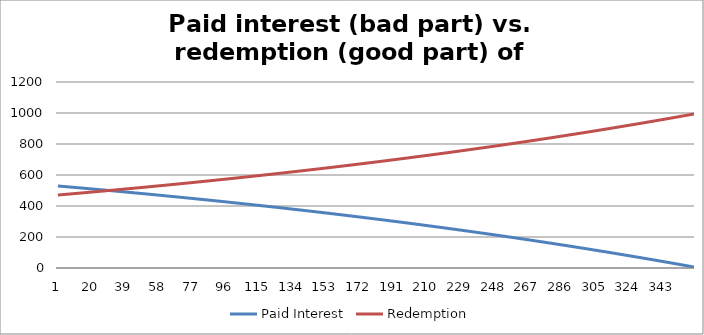
| Category | Paid Interest | Redemption |
|---|---|---|
| 0 | 529.167 | 470.833 |
| 1 | 528.186 | 471.814 |
| 2 | 527.203 | 472.797 |
| 3 | 526.218 | 473.782 |
| 4 | 525.231 | 474.769 |
| 5 | 524.242 | 475.758 |
| 6 | 523.251 | 476.749 |
| 7 | 522.257 | 477.743 |
| 8 | 521.262 | 478.738 |
| 9 | 520.265 | 479.735 |
| 10 | 519.265 | 480.735 |
| 11 | 518.264 | 481.736 |
| 12 | 517.26 | 482.74 |
| 13 | 516.254 | 483.746 |
| 14 | 515.247 | 484.753 |
| 15 | 514.237 | 485.763 |
| 16 | 513.225 | 486.775 |
| 17 | 512.21 | 487.79 |
| 18 | 511.194 | 488.806 |
| 19 | 510.176 | 489.824 |
| 20 | 509.155 | 490.845 |
| 21 | 508.133 | 491.867 |
| 22 | 507.108 | 492.892 |
| 23 | 506.081 | 493.919 |
| 24 | 505.052 | 494.948 |
| 25 | 504.021 | 495.979 |
| 26 | 502.988 | 497.012 |
| 27 | 501.952 | 498.048 |
| 28 | 500.915 | 499.085 |
| 29 | 499.875 | 500.125 |
| 30 | 498.833 | 501.167 |
| 31 | 497.789 | 502.211 |
| 32 | 496.743 | 503.257 |
| 33 | 495.694 | 504.306 |
| 34 | 494.644 | 505.356 |
| 35 | 493.591 | 506.409 |
| 36 | 492.536 | 507.464 |
| 37 | 491.479 | 508.521 |
| 38 | 490.419 | 509.581 |
| 39 | 489.358 | 510.642 |
| 40 | 488.294 | 511.706 |
| 41 | 487.228 | 512.772 |
| 42 | 486.159 | 513.841 |
| 43 | 485.089 | 514.911 |
| 44 | 484.016 | 515.984 |
| 45 | 482.941 | 517.059 |
| 46 | 481.864 | 518.136 |
| 47 | 480.785 | 519.215 |
| 48 | 479.703 | 520.297 |
| 49 | 478.619 | 521.381 |
| 50 | 477.533 | 522.467 |
| 51 | 476.444 | 523.556 |
| 52 | 475.353 | 524.647 |
| 53 | 474.26 | 525.74 |
| 54 | 473.165 | 526.835 |
| 55 | 472.068 | 527.932 |
| 56 | 470.968 | 529.032 |
| 57 | 469.866 | 530.134 |
| 58 | 468.761 | 531.239 |
| 59 | 467.654 | 532.346 |
| 60 | 466.545 | 533.455 |
| 61 | 465.434 | 534.566 |
| 62 | 464.32 | 535.68 |
| 63 | 463.204 | 536.796 |
| 64 | 462.086 | 537.914 |
| 65 | 460.965 | 539.035 |
| 66 | 459.842 | 540.158 |
| 67 | 458.717 | 541.283 |
| 68 | 457.589 | 542.411 |
| 69 | 456.459 | 543.541 |
| 70 | 455.327 | 544.673 |
| 71 | 454.192 | 545.808 |
| 72 | 453.055 | 546.945 |
| 73 | 451.916 | 548.084 |
| 74 | 450.774 | 549.226 |
| 75 | 449.63 | 550.37 |
| 76 | 448.483 | 551.517 |
| 77 | 447.334 | 552.666 |
| 78 | 446.183 | 553.817 |
| 79 | 445.029 | 554.971 |
| 80 | 443.873 | 556.127 |
| 81 | 442.714 | 557.286 |
| 82 | 441.553 | 558.447 |
| 83 | 440.39 | 559.61 |
| 84 | 439.224 | 560.776 |
| 85 | 438.055 | 561.945 |
| 86 | 436.885 | 563.115 |
| 87 | 435.712 | 564.288 |
| 88 | 434.536 | 565.464 |
| 89 | 433.358 | 566.642 |
| 90 | 432.177 | 567.823 |
| 91 | 430.994 | 569.006 |
| 92 | 429.809 | 570.191 |
| 93 | 428.621 | 571.379 |
| 94 | 427.431 | 572.569 |
| 95 | 426.238 | 573.762 |
| 96 | 425.042 | 574.958 |
| 97 | 423.845 | 576.155 |
| 98 | 422.644 | 577.356 |
| 99 | 421.442 | 578.558 |
| 100 | 420.236 | 579.764 |
| 101 | 419.028 | 580.972 |
| 102 | 417.818 | 582.182 |
| 103 | 416.605 | 583.395 |
| 104 | 415.39 | 584.61 |
| 105 | 414.172 | 585.828 |
| 106 | 412.951 | 587.049 |
| 107 | 411.728 | 588.272 |
| 108 | 410.503 | 589.497 |
| 109 | 409.275 | 590.725 |
| 110 | 408.044 | 591.956 |
| 111 | 406.811 | 593.189 |
| 112 | 405.575 | 594.425 |
| 113 | 404.336 | 595.664 |
| 114 | 403.096 | 596.904 |
| 115 | 401.852 | 598.148 |
| 116 | 400.606 | 599.394 |
| 117 | 399.357 | 600.643 |
| 118 | 398.106 | 601.894 |
| 119 | 396.852 | 603.148 |
| 120 | 395.595 | 604.405 |
| 121 | 394.336 | 605.664 |
| 122 | 393.074 | 606.926 |
| 123 | 391.81 | 608.19 |
| 124 | 390.543 | 609.457 |
| 125 | 389.273 | 610.727 |
| 126 | 388.001 | 611.999 |
| 127 | 386.726 | 613.274 |
| 128 | 385.448 | 614.552 |
| 129 | 384.168 | 615.832 |
| 130 | 382.885 | 617.115 |
| 131 | 381.599 | 618.401 |
| 132 | 380.311 | 619.689 |
| 133 | 379.02 | 620.98 |
| 134 | 377.726 | 622.274 |
| 135 | 376.43 | 623.57 |
| 136 | 375.131 | 624.869 |
| 137 | 373.829 | 626.171 |
| 138 | 372.524 | 627.476 |
| 139 | 371.217 | 628.783 |
| 140 | 369.907 | 630.093 |
| 141 | 368.594 | 631.406 |
| 142 | 367.279 | 632.721 |
| 143 | 365.961 | 634.039 |
| 144 | 364.64 | 635.36 |
| 145 | 363.316 | 636.684 |
| 146 | 361.99 | 638.01 |
| 147 | 360.661 | 639.339 |
| 148 | 359.329 | 640.671 |
| 149 | 357.994 | 642.006 |
| 150 | 356.656 | 643.344 |
| 151 | 355.316 | 644.684 |
| 152 | 353.973 | 646.027 |
| 153 | 352.627 | 647.373 |
| 154 | 351.278 | 648.722 |
| 155 | 349.927 | 650.073 |
| 156 | 348.573 | 651.427 |
| 157 | 347.215 | 652.785 |
| 158 | 345.855 | 654.145 |
| 159 | 344.493 | 655.507 |
| 160 | 343.127 | 656.873 |
| 161 | 341.758 | 658.242 |
| 162 | 340.387 | 659.613 |
| 163 | 339.013 | 660.987 |
| 164 | 337.636 | 662.364 |
| 165 | 336.256 | 663.744 |
| 166 | 334.873 | 665.127 |
| 167 | 333.487 | 666.513 |
| 168 | 332.099 | 667.901 |
| 169 | 330.707 | 669.293 |
| 170 | 329.313 | 670.687 |
| 171 | 327.916 | 672.084 |
| 172 | 326.516 | 673.484 |
| 173 | 325.113 | 674.887 |
| 174 | 323.707 | 676.293 |
| 175 | 322.298 | 677.702 |
| 176 | 320.886 | 679.114 |
| 177 | 319.471 | 680.529 |
| 178 | 318.053 | 681.947 |
| 179 | 316.632 | 683.368 |
| 180 | 315.209 | 684.791 |
| 181 | 313.782 | 686.218 |
| 182 | 312.352 | 687.648 |
| 183 | 310.92 | 689.08 |
| 184 | 309.484 | 690.516 |
| 185 | 308.046 | 691.954 |
| 186 | 306.604 | 693.396 |
| 187 | 305.16 | 694.84 |
| 188 | 303.712 | 696.288 |
| 189 | 302.261 | 697.739 |
| 190 | 300.808 | 699.192 |
| 191 | 299.351 | 700.649 |
| 192 | 297.891 | 702.109 |
| 193 | 296.429 | 703.571 |
| 194 | 294.963 | 705.037 |
| 195 | 293.494 | 706.506 |
| 196 | 292.022 | 707.978 |
| 197 | 290.547 | 709.453 |
| 198 | 289.069 | 710.931 |
| 199 | 287.588 | 712.412 |
| 200 | 286.104 | 713.896 |
| 201 | 284.617 | 715.383 |
| 202 | 283.126 | 716.874 |
| 203 | 281.633 | 718.367 |
| 204 | 280.136 | 719.864 |
| 205 | 278.636 | 721.364 |
| 206 | 277.134 | 722.866 |
| 207 | 275.628 | 724.372 |
| 208 | 274.119 | 725.881 |
| 209 | 272.606 | 727.394 |
| 210 | 271.091 | 728.909 |
| 211 | 269.572 | 730.428 |
| 212 | 268.051 | 731.949 |
| 213 | 266.526 | 733.474 |
| 214 | 264.998 | 735.002 |
| 215 | 263.466 | 736.534 |
| 216 | 261.932 | 738.068 |
| 217 | 260.394 | 739.606 |
| 218 | 258.853 | 741.147 |
| 219 | 257.309 | 742.691 |
| 220 | 255.762 | 744.238 |
| 221 | 254.212 | 745.788 |
| 222 | 252.658 | 747.342 |
| 223 | 251.101 | 748.899 |
| 224 | 249.541 | 750.459 |
| 225 | 247.977 | 752.023 |
| 226 | 246.411 | 753.589 |
| 227 | 244.841 | 755.159 |
| 228 | 243.267 | 756.733 |
| 229 | 241.691 | 758.309 |
| 230 | 240.111 | 759.889 |
| 231 | 238.528 | 761.472 |
| 232 | 236.941 | 763.059 |
| 233 | 235.352 | 764.648 |
| 234 | 233.759 | 766.241 |
| 235 | 232.162 | 767.838 |
| 236 | 230.563 | 769.437 |
| 237 | 228.96 | 771.04 |
| 238 | 227.353 | 772.647 |
| 239 | 225.744 | 774.256 |
| 240 | 224.131 | 775.869 |
| 241 | 222.514 | 777.486 |
| 242 | 220.895 | 779.105 |
| 243 | 219.271 | 780.729 |
| 244 | 217.645 | 782.355 |
| 245 | 216.015 | 783.985 |
| 246 | 214.382 | 785.618 |
| 247 | 212.745 | 787.255 |
| 248 | 211.105 | 788.895 |
| 249 | 209.461 | 790.539 |
| 250 | 207.814 | 792.186 |
| 251 | 206.164 | 793.836 |
| 252 | 204.51 | 795.49 |
| 253 | 202.853 | 797.147 |
| 254 | 201.192 | 798.808 |
| 255 | 199.528 | 800.472 |
| 256 | 197.86 | 802.14 |
| 257 | 196.189 | 803.811 |
| 258 | 194.515 | 805.485 |
| 259 | 192.837 | 807.163 |
| 260 | 191.155 | 808.845 |
| 261 | 189.47 | 810.53 |
| 262 | 187.781 | 812.219 |
| 263 | 186.089 | 813.911 |
| 264 | 184.393 | 815.607 |
| 265 | 182.694 | 817.306 |
| 266 | 180.992 | 819.008 |
| 267 | 179.285 | 820.715 |
| 268 | 177.575 | 822.425 |
| 269 | 175.862 | 824.138 |
| 270 | 174.145 | 825.855 |
| 271 | 172.425 | 827.575 |
| 272 | 170.7 | 829.3 |
| 273 | 168.973 | 831.027 |
| 274 | 167.241 | 832.759 |
| 275 | 165.507 | 834.493 |
| 276 | 163.768 | 836.232 |
| 277 | 162.026 | 837.974 |
| 278 | 160.28 | 839.72 |
| 279 | 158.531 | 841.469 |
| 280 | 156.778 | 843.222 |
| 281 | 155.021 | 844.979 |
| 282 | 153.261 | 846.739 |
| 283 | 151.496 | 848.504 |
| 284 | 149.729 | 850.271 |
| 285 | 147.957 | 852.043 |
| 286 | 146.182 | 853.818 |
| 287 | 144.404 | 855.596 |
| 288 | 142.621 | 857.379 |
| 289 | 140.835 | 859.165 |
| 290 | 139.045 | 860.955 |
| 291 | 137.251 | 862.749 |
| 292 | 135.454 | 864.546 |
| 293 | 133.653 | 866.347 |
| 294 | 131.848 | 868.152 |
| 295 | 130.039 | 869.961 |
| 296 | 128.227 | 871.773 |
| 297 | 126.411 | 873.589 |
| 298 | 124.591 | 875.409 |
| 299 | 122.767 | 877.233 |
| 300 | 120.939 | 879.061 |
| 301 | 119.108 | 880.892 |
| 302 | 117.273 | 882.727 |
| 303 | 115.434 | 884.566 |
| 304 | 113.591 | 886.409 |
| 305 | 111.744 | 888.256 |
| 306 | 109.894 | 890.106 |
| 307 | 108.039 | 891.961 |
| 308 | 106.181 | 893.819 |
| 309 | 104.319 | 895.681 |
| 310 | 102.453 | 897.547 |
| 311 | 100.583 | 899.417 |
| 312 | 98.709 | 901.291 |
| 313 | 96.831 | 903.169 |
| 314 | 94.95 | 905.05 |
| 315 | 93.064 | 906.936 |
| 316 | 91.175 | 908.825 |
| 317 | 89.281 | 910.719 |
| 318 | 87.384 | 912.616 |
| 319 | 85.483 | 914.517 |
| 320 | 83.578 | 916.422 |
| 321 | 81.668 | 918.332 |
| 322 | 79.755 | 920.245 |
| 323 | 77.838 | 922.162 |
| 324 | 75.917 | 924.083 |
| 325 | 73.992 | 926.008 |
| 326 | 72.063 | 927.937 |
| 327 | 70.129 | 929.871 |
| 328 | 68.192 | 931.808 |
| 329 | 66.251 | 933.749 |
| 330 | 64.306 | 935.694 |
| 331 | 62.356 | 937.644 |
| 332 | 60.403 | 939.597 |
| 333 | 58.445 | 941.555 |
| 334 | 56.484 | 943.516 |
| 335 | 54.518 | 945.482 |
| 336 | 52.548 | 947.452 |
| 337 | 50.574 | 949.426 |
| 338 | 48.596 | 951.404 |
| 339 | 46.614 | 953.386 |
| 340 | 44.628 | 955.372 |
| 341 | 42.638 | 957.362 |
| 342 | 40.643 | 959.357 |
| 343 | 38.645 | 961.355 |
| 344 | 36.642 | 963.358 |
| 345 | 34.635 | 965.365 |
| 346 | 32.624 | 967.376 |
| 347 | 30.608 | 969.392 |
| 348 | 28.589 | 971.411 |
| 349 | 26.565 | 973.435 |
| 350 | 24.537 | 975.463 |
| 351 | 22.505 | 977.495 |
| 352 | 20.468 | 979.532 |
| 353 | 18.428 | 981.572 |
| 354 | 16.383 | 983.617 |
| 355 | 14.333 | 985.667 |
| 356 | 12.28 | 987.72 |
| 357 | 10.222 | 989.778 |
| 358 | 8.16 | 991.84 |
| 359 | 6.094 | 993.906 |